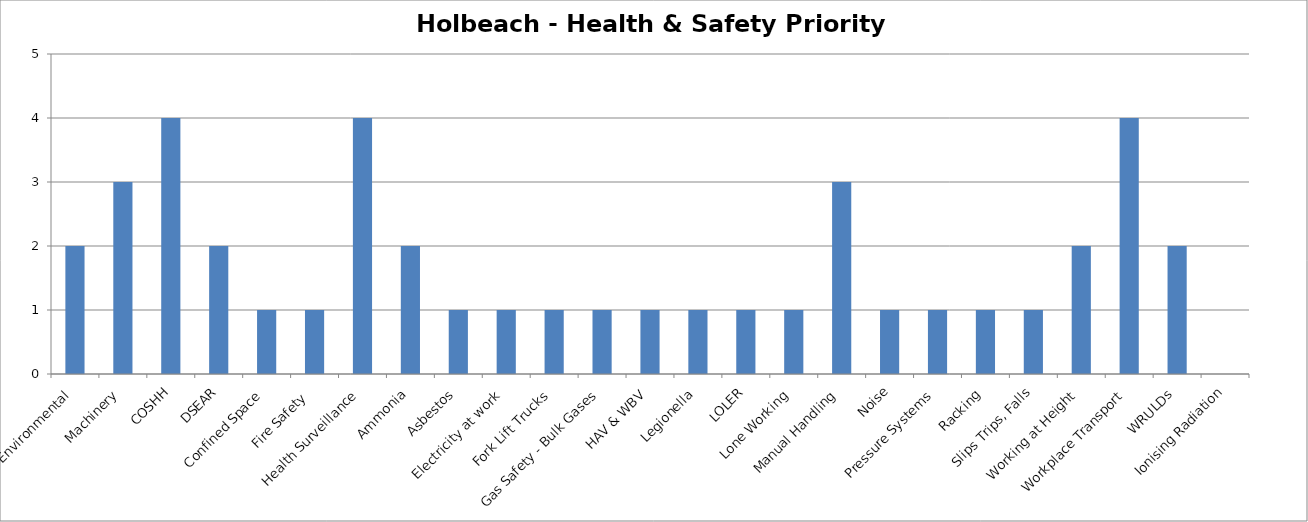
| Category | Series 0 |
|---|---|
| Environmental | 2 |
| Machinery | 3 |
| COSHH | 4 |
| DSEAR | 2 |
| Confined Space | 1 |
| Fire Safety  | 1 |
| Health Surveillance  | 4 |
| Ammonia | 2 |
| Asbestos | 1 |
| Electricity at work | 1 |
| Fork Lift Trucks | 1 |
| Gas Safety - Bulk Gases | 1 |
| HAV & WBV | 1 |
| Legionella | 1 |
| LOLER | 1 |
| Lone Working | 1 |
| Manual Handling | 3 |
| Noise | 1 |
| Pressure Systems  | 1 |
| Racking | 1 |
| Slips Trips, Falls | 1 |
| Working at Height | 2 |
| Workplace Transport | 4 |
| WRULDs | 2 |
| Ionising Radiation | 0 |